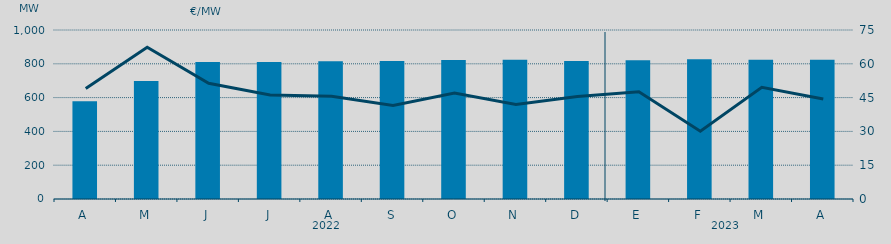
| Category | Potencia media a subir |
|---|---|
| A | 578.1 |
| M | 697.8 |
| J | 810.166 |
| J | 810.419 |
| A | 815.058 |
| S | 816.21 |
| O | 822.826 |
| N | 823.957 |
| D | 816.374 |
| E | 820.977 |
| F | 826.222 |
| M | 823.778 |
| A | 823.61 |